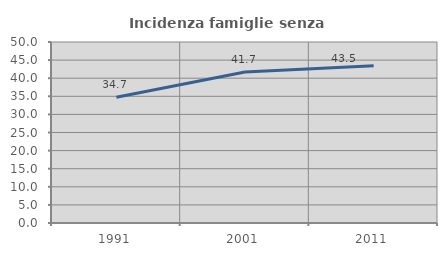
| Category | Incidenza famiglie senza nuclei |
|---|---|
| 1991.0 | 34.747 |
| 2001.0 | 41.739 |
| 2011.0 | 43.452 |